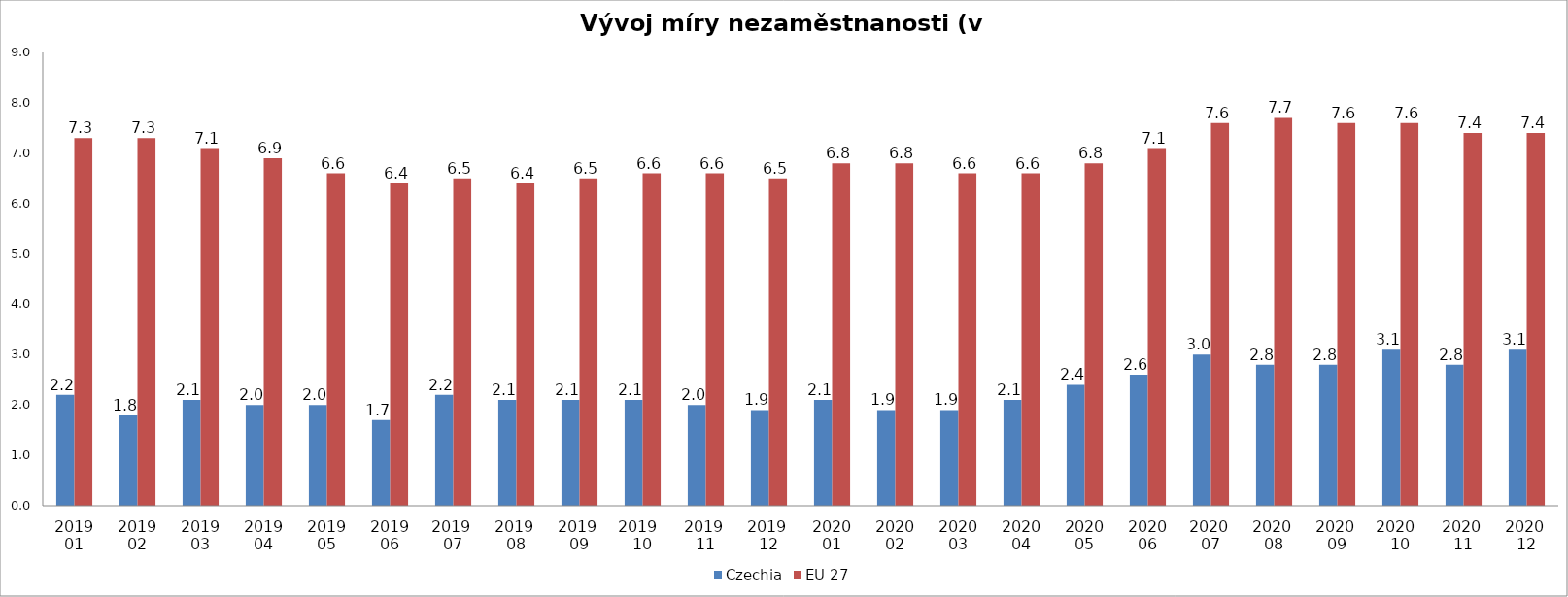
| Category | Czechia | EU 27 |
|---|---|---|
| 2019 01 | 2.2 | 7.3 |
| 2019 02 | 1.8 | 7.3 |
| 2019 03 | 2.1 | 7.1 |
| 2019 04 | 2 | 6.9 |
| 2019 05 | 2 | 6.6 |
| 2019 06 | 1.7 | 6.4 |
| 2019  07 | 2.2 | 6.5 |
| 2019  08 | 2.1 | 6.4 |
| 2019  09 | 2.1 | 6.5 |
| 2019   10 | 2.1 | 6.6 |
| 2019  11 | 2 | 6.6 |
| 2019  12 | 1.9 | 6.5 |
| 2020 01 | 2.1 | 6.8 |
| 2020 02 | 1.9 | 6.8 |
| 2020 03 | 1.9 | 6.6 |
| 2020 04 | 2.1 | 6.6 |
| 2020 05 | 2.4 | 6.8 |
| 2020 06 | 2.6 | 7.1 |
| 2020  07 | 3 | 7.6 |
| 2020  08 | 2.8 | 7.7 |
| 2020  09 | 2.8 | 7.6 |
| 2020   10 | 3.1 | 7.6 |
| 2020  11 | 2.8 | 7.4 |
| 2020  12 | 3.1 | 7.4 |